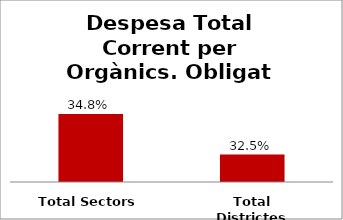
| Category | Series 0 |
|---|---|
| Total Sectors | 0.348 |
| Total Districtes | 0.325 |